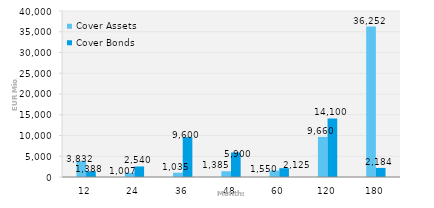
| Category | Cover Assets | Cover Bonds |
|---|---|---|
| 12.0 | 3831.56 | 1387.5 |
| 24.0 | 1006.99 | 2540 |
| 36.0 | 1034.63 | 9600 |
| 48.0 | 1385.04 | 5900 |
| 60.0 | 1549.96 | 2125 |
| 120.0 | 9660.38 | 14100 |
| 180.0 | 36251.62 | 2184.2 |